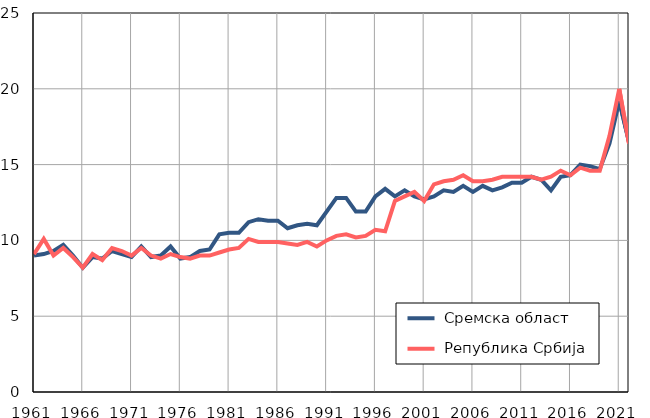
| Category |  Сремска област |  Република Србија |
|---|---|---|
| 1961.0 | 9 | 9.1 |
| 1962.0 | 9.1 | 10.1 |
| 1963.0 | 9.3 | 9 |
| 1964.0 | 9.7 | 9.5 |
| 1965.0 | 9 | 8.9 |
| 1966.0 | 8.2 | 8.2 |
| 1967.0 | 8.9 | 9.1 |
| 1968.0 | 8.8 | 8.7 |
| 1969.0 | 9.3 | 9.5 |
| 1970.0 | 9.1 | 9.3 |
| 1971.0 | 8.9 | 9 |
| 1972.0 | 9.6 | 9.5 |
| 1973.0 | 8.9 | 9 |
| 1974.0 | 9 | 8.8 |
| 1975.0 | 9.6 | 9.1 |
| 1976.0 | 8.8 | 8.9 |
| 1977.0 | 8.9 | 8.8 |
| 1978.0 | 9.3 | 9 |
| 1979.0 | 9.4 | 9 |
| 1980.0 | 10.4 | 9.2 |
| 1981.0 | 10.5 | 9.4 |
| 1982.0 | 10.5 | 9.5 |
| 1983.0 | 11.2 | 10.1 |
| 1984.0 | 11.4 | 9.9 |
| 1985.0 | 11.3 | 9.9 |
| 1986.0 | 11.3 | 9.9 |
| 1987.0 | 10.8 | 9.8 |
| 1988.0 | 11 | 9.7 |
| 1989.0 | 11.1 | 9.9 |
| 1990.0 | 11 | 9.6 |
| 1991.0 | 11.9 | 10 |
| 1992.0 | 12.8 | 10.3 |
| 1993.0 | 12.8 | 10.4 |
| 1994.0 | 11.9 | 10.2 |
| 1995.0 | 11.9 | 10.3 |
| 1996.0 | 12.9 | 10.7 |
| 1997.0 | 13.4 | 10.6 |
| 1998.0 | 12.9 | 12.6 |
| 1999.0 | 13.3 | 12.9 |
| 2000.0 | 12.9 | 13.2 |
| 2001.0 | 12.7 | 12.6 |
| 2002.0 | 12.9 | 13.7 |
| 2003.0 | 13.3 | 13.9 |
| 2004.0 | 13.2 | 14 |
| 2005.0 | 13.6 | 14.3 |
| 2006.0 | 13.2 | 13.9 |
| 2007.0 | 13.6 | 13.9 |
| 2008.0 | 13.3 | 14 |
| 2009.0 | 13.5 | 14.2 |
| 2010.0 | 13.8 | 14.2 |
| 2011.0 | 13.8 | 14.2 |
| 2012.0 | 14.2 | 14.2 |
| 2013.0 | 14 | 14 |
| 2014.0 | 13.3 | 14.2 |
| 2015.0 | 14.2 | 14.6 |
| 2016.0 | 14.3 | 14.3 |
| 2017.0 | 15 | 14.8 |
| 2018.0 | 14.9 | 14.6 |
| 2019.0 | 14.7 | 14.6 |
| 2020.0 | 16.4 | 16.9 |
| 2021.0 | 19.2 | 20 |
| 2022.0 | 16.5 | 16.4 |